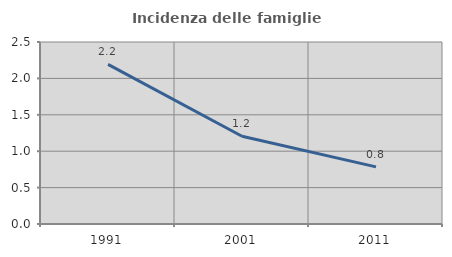
| Category | Incidenza delle famiglie numerose |
|---|---|
| 1991.0 | 2.193 |
| 2001.0 | 1.205 |
| 2011.0 | 0.784 |